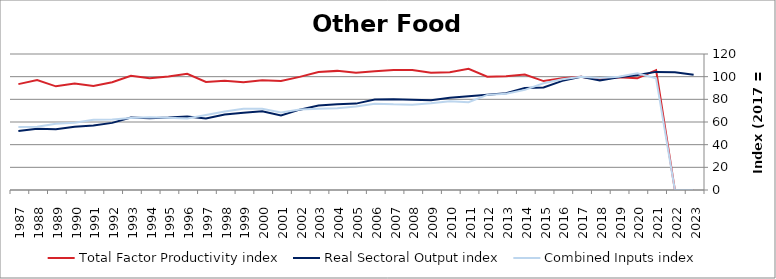
| Category | Total Factor Productivity index | Real Sectoral Output index | Combined Inputs index |
|---|---|---|---|
| 2023.0 | 0 | 101.761 | 0 |
| 2022.0 | 0 | 103.905 | 0 |
| 2021.0 | 105.793 | 104.225 | 98.518 |
| 2020.0 | 98.552 | 101.407 | 102.897 |
| 2019.0 | 99.483 | 99.445 | 99.962 |
| 2018.0 | 97.657 | 96.601 | 98.918 |
| 2017.0 | 100 | 100 | 100 |
| 2016.0 | 98.519 | 96.295 | 97.742 |
| 2015.0 | 96.094 | 90.516 | 94.194 |
| 2014.0 | 101.883 | 90.02 | 88.356 |
| 2013.0 | 100.452 | 85.405 | 85.021 |
| 2012.0 | 100.004 | 83.94 | 83.937 |
| 2011.0 | 106.91 | 82.749 | 77.4 |
| 2010.0 | 103.972 | 81.491 | 78.378 |
| 2009.0 | 103.56 | 79.278 | 76.553 |
| 2008.0 | 105.847 | 79.699 | 75.296 |
| 2007.0 | 105.966 | 80.062 | 75.555 |
| 2006.0 | 104.678 | 79.75 | 76.187 |
| 2005.0 | 103.531 | 76.221 | 73.621 |
| 2004.0 | 105.108 | 75.715 | 72.035 |
| 2003.0 | 104.044 | 74.568 | 71.67 |
| 2002.0 | 99.815 | 70.886 | 71.017 |
| 2001.0 | 96.126 | 65.776 | 68.427 |
| 2000.0 | 96.904 | 69.379 | 71.596 |
| 1999.0 | 95.081 | 68.083 | 71.606 |
| 1998.0 | 96.408 | 66.695 | 69.179 |
| 1997.0 | 95.342 | 63.027 | 66.107 |
| 1996.0 | 102.591 | 64.776 | 63.14 |
| 1995.0 | 100.09 | 63.891 | 63.833 |
| 1994.0 | 98.677 | 63.41 | 64.26 |
| 1993.0 | 100.79 | 64.004 | 63.502 |
| 1992.0 | 95.086 | 59.217 | 62.278 |
| 1991.0 | 91.792 | 56.842 | 61.924 |
| 1990.0 | 94.046 | 55.877 | 59.415 |
| 1989.0 | 91.465 | 53.503 | 58.495 |
| 1988.0 | 97.118 | 54.118 | 55.724 |
| 1987.0 | 93.433 | 51.987 | 55.642 |